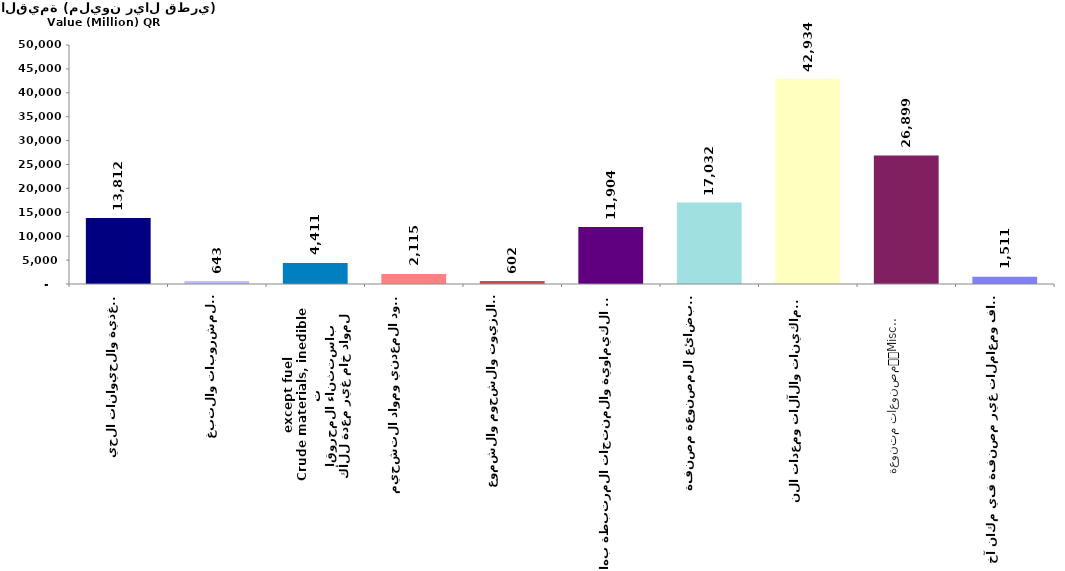
| Category | Series 0 |
|---|---|
| الأغذية والحيوانات الحية
Food and live animals | 13811.848 |
| المشروبات والتبغ
Beverages and tobacco | 642.651 |
| مواد خام غير معدة للأكل
باستثناء المحروقات
Crude materials, inedible
except fuels | 4411.321 |
| الوقود المعدني ومواد التشحيم
والمواد المشابهة
Mineral fuels, Lubricants
and related materials | 2115.101 |
| الزيوت والشحوم والشموع
الحيوانية والنباتية المنشأ
Animal and vegetable oils,
fats and waxes | 601.871 |
| المواد الكيماوية والمنتجات المرتبطة بها
Chemicals and related products | 11904 |
| البضائع المصنوعة مصنفة
في معظم الأحيان حسب المادة
Manufactured goods classified 
chiefly by materials | 17032.499 |
| الماكينات والآلات ومعدات النقل
Machinery and transport
equipment | 42933.923 |
| مصنوعات متنوعة
Miscellaneous manufactured
goods | 26899.173 |
| أصناف ومعاملات غير مصنفة في مكان آخر
Commodities and transactions
not classified in the SITC | 1511.22 |